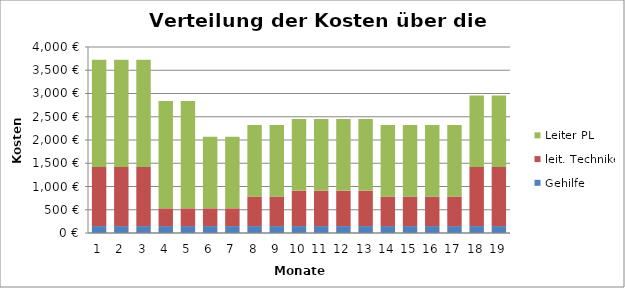
| Category | Gehilfe | leit. Techniker | Leiter PL |
|---|---|---|---|
| 0 | 148.484 | 1272.722 | 2306.809 |
| 1 | 148.484 | 1272.722 | 2306.809 |
| 2 | 148.484 | 1272.722 | 2306.809 |
| 3 | 148.484 | 381.817 | 2306.809 |
| 4 | 148.484 | 381.817 | 2306.809 |
| 5 | 148.484 | 381.817 | 1537.872 |
| 6 | 148.484 | 381.817 | 1537.872 |
| 7 | 148.484 | 636.361 | 1537.872 |
| 8 | 148.484 | 636.361 | 1537.872 |
| 9 | 148.484 | 763.633 | 1537.872 |
| 10 | 148.484 | 763.633 | 1537.872 |
| 11 | 148.484 | 763.633 | 1537.872 |
| 12 | 148.484 | 763.633 | 1537.872 |
| 13 | 148.484 | 636.361 | 1537.872 |
| 14 | 148.484 | 636.361 | 1537.872 |
| 15 | 148.484 | 636.361 | 1537.872 |
| 16 | 148.484 | 636.361 | 1537.872 |
| 17 | 148.484 | 1272.722 | 1537.872 |
| 18 | 148.484 | 1272.722 | 1537.872 |